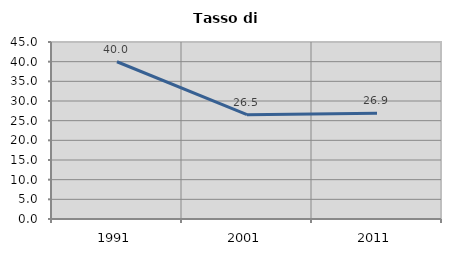
| Category | Tasso di disoccupazione   |
|---|---|
| 1991.0 | 39.976 |
| 2001.0 | 26.525 |
| 2011.0 | 26.906 |